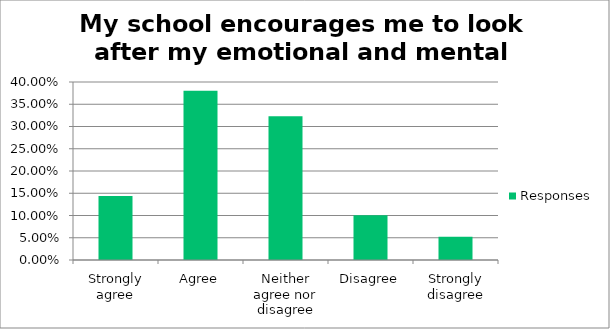
| Category | Responses |
|---|---|
| Strongly agree | 0.144 |
| Agree | 0.381 |
| Neither agree nor disagree | 0.323 |
| Disagree | 0.1 |
| Strongly disagree | 0.052 |